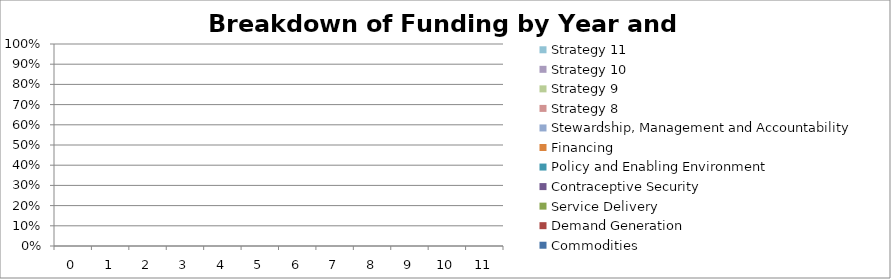
| Category | Commodities | Demand Generation | Service Delivery | Contraceptive Security | Policy and Enabling Environment | Financing | Stewardship, Management and Accountability | Strategy 8 | Strategy 9 | Strategy 10 | Strategy 11 |
|---|---|---|---|---|---|---|---|---|---|---|---|
| 0.0 | 0 | 0 | 0 | 0 | 0 | 0 | 0 | 0 | 0 | 0 | 0 |
| 1.0 | 0 | 0 | 0 | 0 | 0 | 0 | 0 | 0 | 0 | 0 | 0 |
| 2.0 | 0 | 0 | 0 | 0 | 0 | 0 | 0 | 0 | 0 | 0 | 0 |
| 3.0 | 0 | 0 | 0 | 0 | 0 | 0 | 0 | 0 | 0 | 0 | 0 |
| 4.0 | 0 | 0 | 0 | 0 | 0 | 0 | 0 | 0 | 0 | 0 | 0 |
| 5.0 | 0 | 0 | 0 | 0 | 0 | 0 | 0 | 0 | 0 | 0 | 0 |
| 6.0 | 0 | 0 | 0 | 0 | 0 | 0 | 0 | 0 | 0 | 0 | 0 |
| 7.0 | 0 | 0 | 0 | 0 | 0 | 0 | 0 | 0 | 0 | 0 | 0 |
| 8.0 | 0 | 0 | 0 | 0 | 0 | 0 | 0 | 0 | 0 | 0 | 0 |
| 9.0 | 0 | 0 | 0 | 0 | 0 | 0 | 0 | 0 | 0 | 0 | 0 |
| 10.0 | 0 | 0 | 0 | 0 | 0 | 0 | 0 | 0 | 0 | 0 | 0 |
| 11.0 | 0 | 0 | 0 | 0 | 0 | 0 | 0 | 0 | 0 | 0 | 0 |